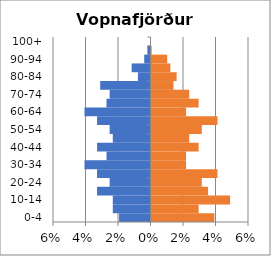
| Category | % Men | % Women |
|---|---|---|
| 0-4 | -0.019 | 0.039 |
| 5-9 | -0.023 | 0.029 |
| 10-14 | -0.023 | 0.048 |
| 15-19 | -0.033 | 0.035 |
| 20-24 | -0.025 | 0.031 |
| 25-29 | -0.033 | 0.041 |
| 30-34 | -0.041 | 0.021 |
| 35-39 | -0.027 | 0.021 |
| 40-44 | -0.033 | 0.029 |
| 45-49 | -0.023 | 0.023 |
| 50-54 | -0.025 | 0.031 |
| 55-59 | -0.033 | 0.041 |
| 60-64 | -0.041 | 0.021 |
| 65-69 | -0.027 | 0.029 |
| 70-74 | -0.025 | 0.023 |
| 75-79 | -0.031 | 0.014 |
| 80-84 | -0.008 | 0.015 |
| 85-89 | -0.012 | 0.012 |
| 90-94 | -0.004 | 0.01 |
| 95-99 | -0.002 | 0 |
| 100+ | 0 | 0 |